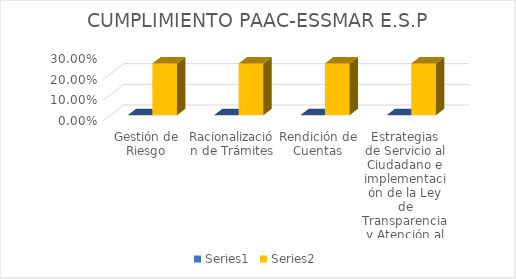
| Category | Series 4 | Series 5 |
|---|---|---|
| Gestión de Riesgo | 0 | 0.25 |
| Racionalización de Trámites | 0 | 0.25 |
| Rendición de Cuentas | 0 | 0.25 |
| Estrategias de Servicio al Ciudadano e implementación de la Ley de Transparencia y Atención al Ciudadano | 0 | 0.25 |